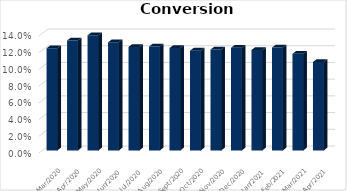
| Category | Conv Rate |
|---|---|
| 2021-04-30 | 0.106 |
| 2021-03-31 | 0.116 |
| 2021-02-28 | 0.123 |
| 2021-01-31 | 0.12 |
| 2020-12-31 | 0.123 |
| 2020-11-30 | 0.121 |
| 2020-10-31 | 0.119 |
| 2020-09-30 | 0.122 |
| 2020-08-31 | 0.124 |
| 2020-07-31 | 0.124 |
| 2020-06-30 | 0.129 |
| 2020-05-31 | 0.138 |
| 2020-04-30 | 0.131 |
| 2020-03-31 | 0.122 |